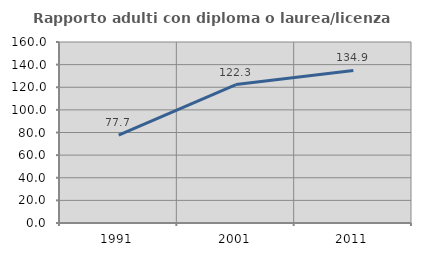
| Category | Rapporto adulti con diploma o laurea/licenza media  |
|---|---|
| 1991.0 | 77.66 |
| 2001.0 | 122.33 |
| 2011.0 | 134.884 |